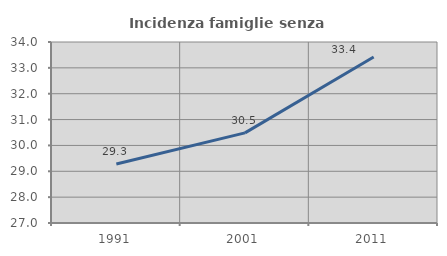
| Category | Incidenza famiglie senza nuclei |
|---|---|
| 1991.0 | 29.285 |
| 2001.0 | 30.487 |
| 2011.0 | 33.422 |